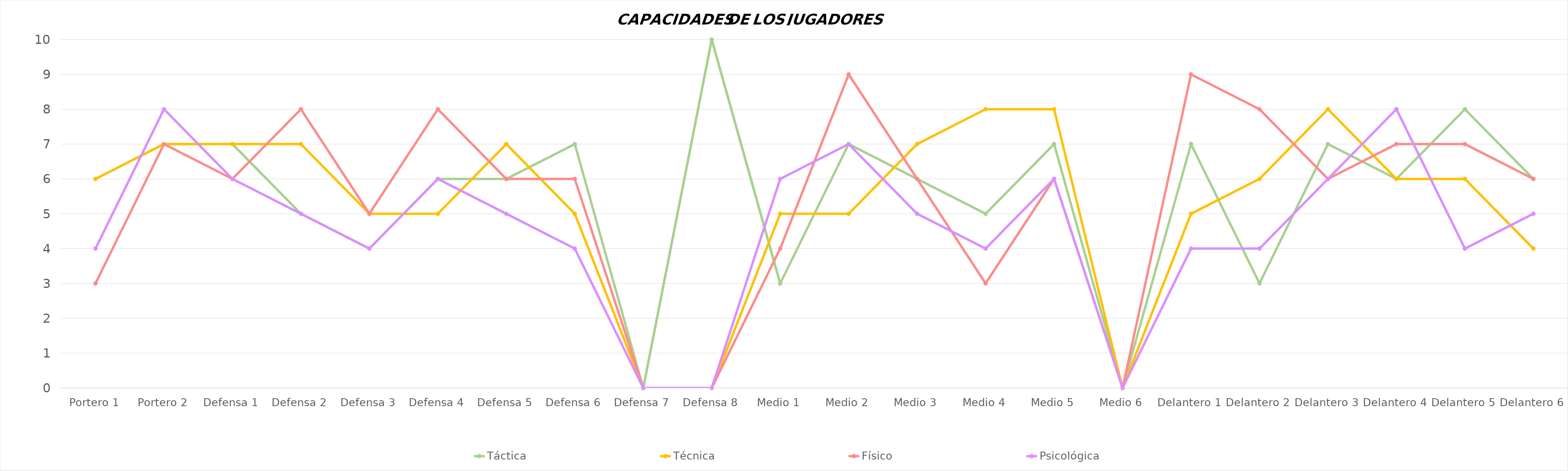
| Category | Táctica | Técnica | Físico | Psicológica |
|---|---|---|---|---|
| Portero 1 | 6 | 6 | 3 | 4 |
| Portero 2 | 7 | 7 | 7 | 8 |
| Defensa 1 | 7 | 7 | 6 | 6 |
| Defensa 2 | 5 | 7 | 8 | 5 |
| Defensa 3 | 4 | 5 | 5 | 4 |
| Defensa 4 | 6 | 5 | 8 | 6 |
| Defensa 5 | 6 | 7 | 6 | 5 |
| Defensa 6 | 7 | 5 | 6 | 4 |
| Defensa 7 | 0 | 0 | 0 | 0 |
| Defensa 8 | 10 | 0 | 0 | 0 |
| Medio 1 | 3 | 5 | 4 | 6 |
| Medio 2 | 7 | 5 | 9 | 7 |
| Medio 3 | 6 | 7 | 6 | 5 |
| Medio 4 | 5 | 8 | 3 | 4 |
| Medio 5 | 7 | 8 | 6 | 6 |
| Medio 6 | 0 | 0 | 0 | 0 |
| Delantero 1 | 7 | 5 | 9 | 4 |
| Delantero 2 | 3 | 6 | 8 | 4 |
| Delantero 3 | 7 | 8 | 6 | 6 |
| Delantero 4 | 6 | 6 | 7 | 8 |
| Delantero 5 | 8 | 6 | 7 | 4 |
| Delantero 6 | 6 | 4 | 6 | 5 |